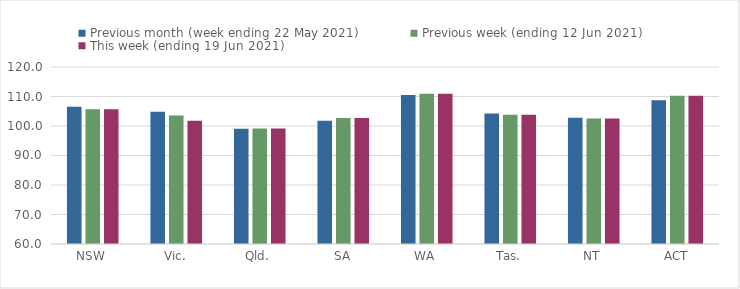
| Category | Previous month (week ending 22 May 2021) | Previous week (ending 12 Jun 2021) | This week (ending 19 Jun 2021) |
|---|---|---|---|
| NSW | 106.55 | 105.68 | 105.68 |
| Vic. | 104.85 | 103.54 | 101.75 |
| Qld. | 99.05 | 99.16 | 99.16 |
| SA | 101.82 | 102.7 | 102.7 |
| WA | 110.48 | 110.94 | 110.94 |
| Tas. | 104.2 | 103.79 | 103.79 |
| NT | 102.76 | 102.51 | 102.51 |
| ACT | 108.7 | 110.23 | 110.23 |